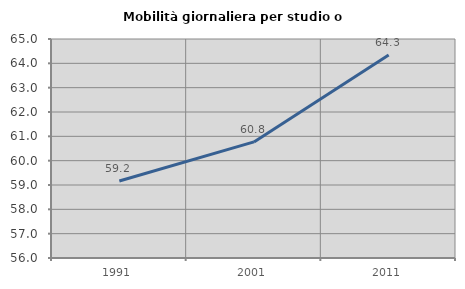
| Category | Mobilità giornaliera per studio o lavoro |
|---|---|
| 1991.0 | 59.164 |
| 2001.0 | 60.772 |
| 2011.0 | 64.341 |